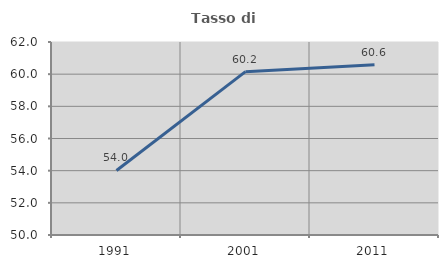
| Category | Tasso di occupazione   |
|---|---|
| 1991.0 | 54.013 |
| 2001.0 | 60.157 |
| 2011.0 | 60.586 |